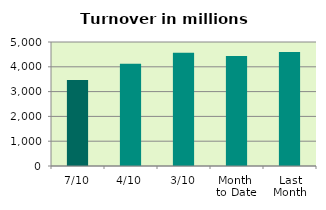
| Category | Series 0 |
|---|---|
| 7/10 | 3472.029 |
| 4/10 | 4123.109 |
| 3/10 | 4569.496 |
| Month 
to Date | 4433.313 |
| Last
Month | 4598.075 |